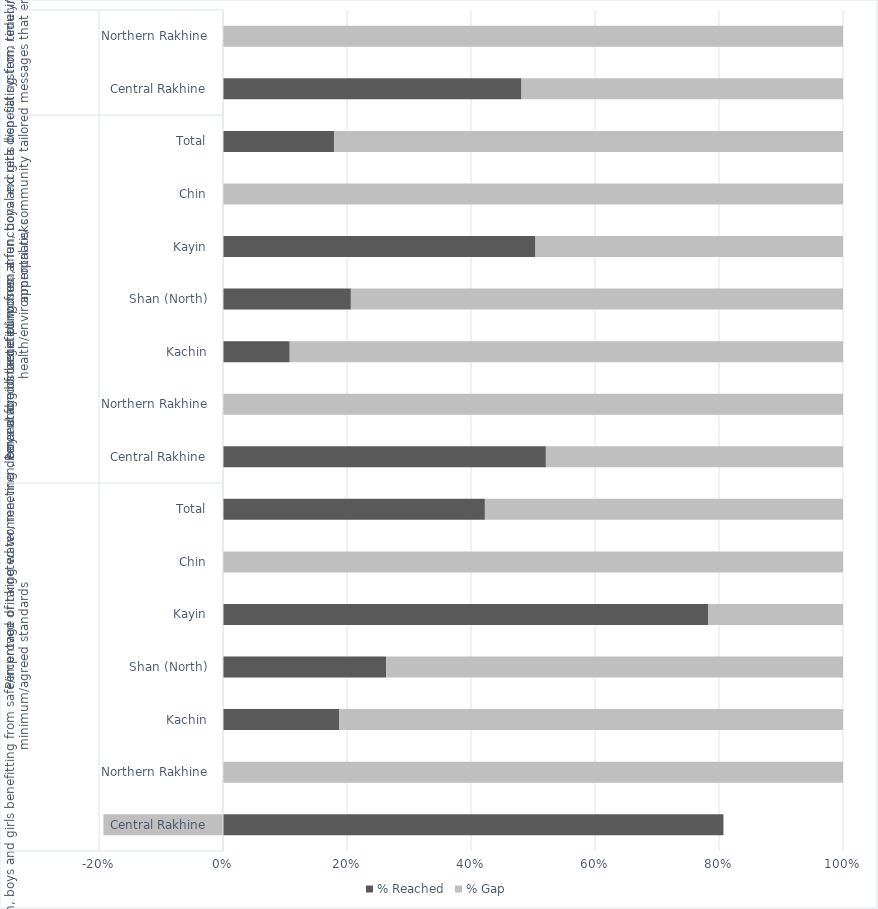
| Category | % Reached | % Gap |
|---|---|---|
| 0 | 1.314 | -0.314 |
| 1 | 0 | 1 |
| 2 | 0.187 | 0.813 |
| 3 | 0.263 | 0.737 |
| 4 | 0.782 | 0.218 |
| 5 | 0 | 1 |
| 6 | 0.422 | 0.578 |
| 7 | 0.521 | 0.479 |
| 8 | 0 | 1 |
| 9 | 0.108 | 0.892 |
| 10 | 0.206 | 0.794 |
| 11 | 0.504 | 0.496 |
| 12 | 0 | 1 |
| 13 | 0.179 | 0.821 |
| 14 | 0.481 | 0.519 |
| 15 | 0 | 1 |